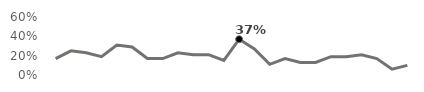
| Category | Wednesday |
|---|---|
| 1994.0 | 0.17 |
| 1995.0 | 0.25 |
| 1996.0 | 0.23 |
| 1997.0 | 0.19 |
| 1998.0 | 0.31 |
| 1999.0 | 0.29 |
| 2000.0 | 0.17 |
| 2001.0 | 0.17 |
| 2002.0 | 0.23 |
| 2003.0 | 0.21 |
| 2004.0 | 0.21 |
| 2005.0 | 0.15 |
| 2006.0 | 0.37 |
| 2007.0 | 0.27 |
| 2008.0 | 0.11 |
| 2009.0 | 0.17 |
| 2010.0 | 0.13 |
| 2011.0 | 0.13 |
| 2012.0 | 0.19 |
| 2013.0 | 0.19 |
| 2014.0 | 0.21 |
| 2015.0 | 0.17 |
| 2016.0 | 0.06 |
| 2017.0 | 0.1 |